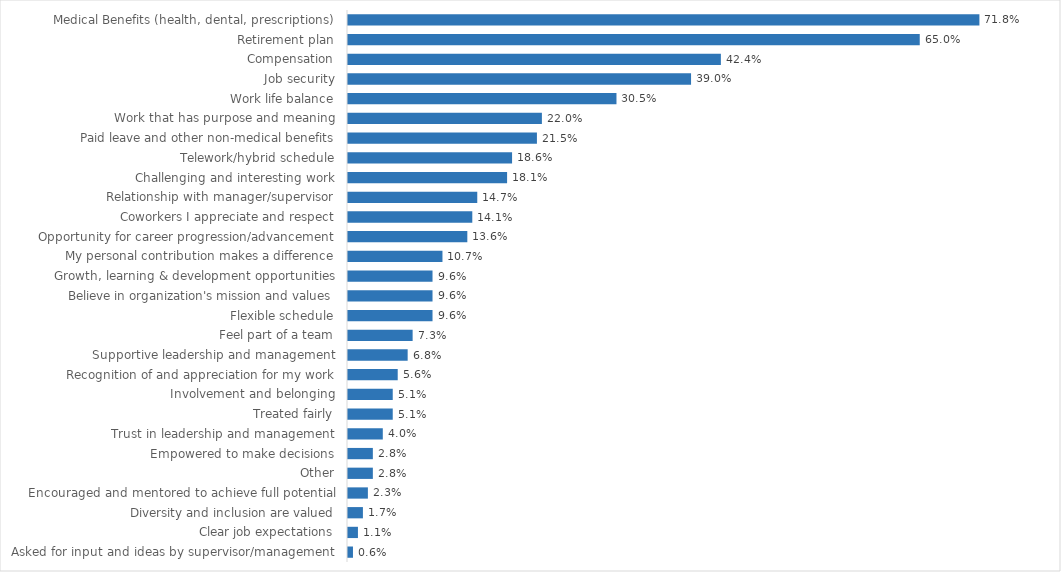
| Category | Public Safety |
|---|---|
| Medical Benefits (health, dental, prescriptions) | 0.718 |
| Retirement plan | 0.65 |
| Compensation | 0.424 |
| Job security | 0.39 |
| Work life balance | 0.305 |
| Work that has purpose and meaning | 0.22 |
| Paid leave and other non-medical benefits | 0.215 |
| Telework/hybrid schedule | 0.186 |
| Challenging and interesting work | 0.181 |
| Relationship with manager/supervisor | 0.147 |
| Coworkers I appreciate and respect | 0.141 |
| Opportunity for career progression/advancement | 0.136 |
| My personal contribution makes a difference | 0.107 |
| Growth, learning & development opportunities | 0.096 |
| Believe in organization's mission and values | 0.096 |
| Flexible schedule | 0.096 |
| Feel part of a team | 0.073 |
| Supportive leadership and management | 0.068 |
| Recognition of and appreciation for my work | 0.056 |
| Involvement and belonging | 0.051 |
| Treated fairly | 0.051 |
| Trust in leadership and management | 0.04 |
| Empowered to make decisions | 0.028 |
| Other | 0.028 |
| Encouraged and mentored to achieve full potential | 0.023 |
| Diversity and inclusion are valued | 0.017 |
| Clear job expectations | 0.011 |
| Asked for input and ideas by supervisor/management | 0.006 |